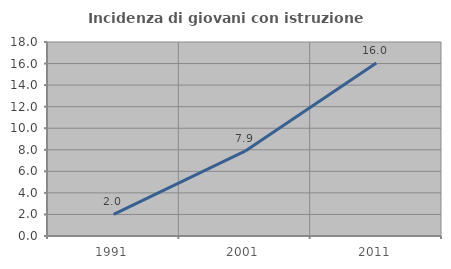
| Category | Incidenza di giovani con istruzione universitaria |
|---|---|
| 1991.0 | 2 |
| 2001.0 | 7.874 |
| 2011.0 | 16.049 |